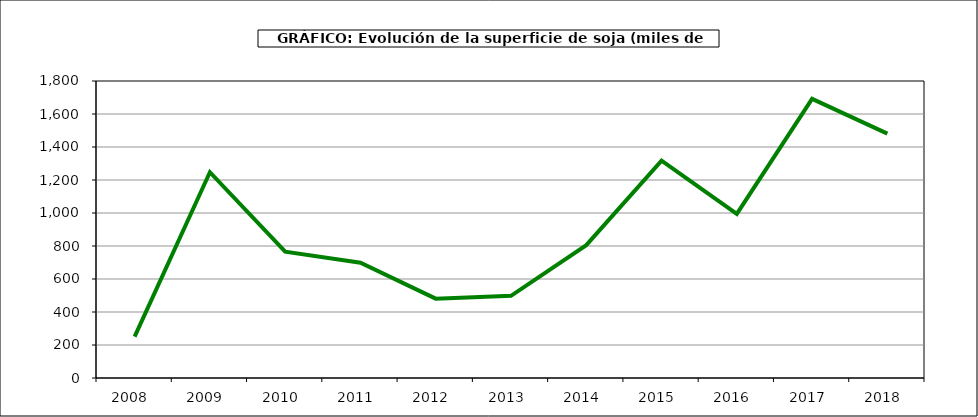
| Category | Superficie |
|---|---|
| 2008.0 | 251 |
| 2009.0 | 1247 |
| 2010.0 | 766 |
| 2011.0 | 699 |
| 2012.0 | 481 |
| 2013.0 | 498 |
| 2014.0 | 805 |
| 2015.0 | 1317 |
| 2016.0 | 995 |
| 2017.0 | 1692 |
| 2018.0 | 1481 |